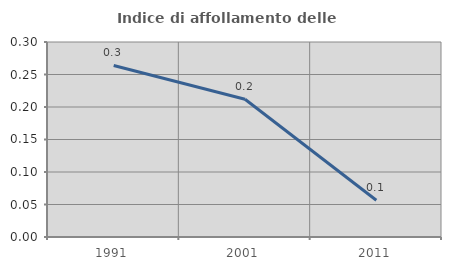
| Category | Indice di affollamento delle abitazioni  |
|---|---|
| 1991.0 | 0.264 |
| 2001.0 | 0.212 |
| 2011.0 | 0.057 |